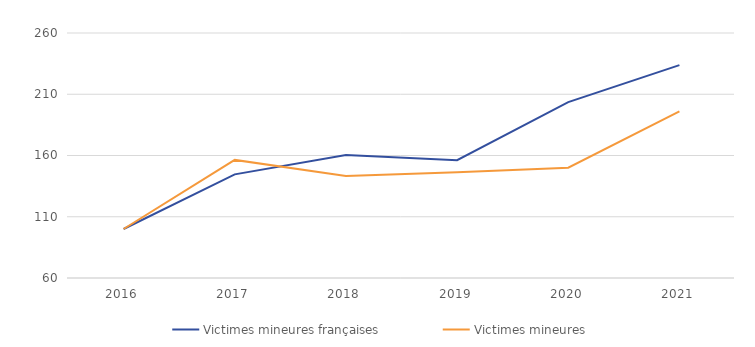
| Category | Victimes mineures françaises | Victimes mineures |
|---|---|---|
| 2016.0 | 100 | 100 |
| 2017.0 | 144.604 | 156.4 |
| 2018.0 | 160.432 | 143.2 |
| 2019.0 | 156.115 | 146.4 |
| 2020.0 | 203.597 | 150 |
| 2021.0 | 233.813 | 196 |